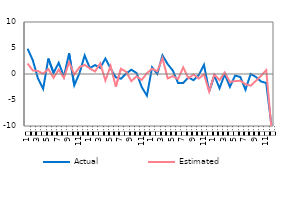
| Category | Actual | Estimated |
|---|---|---|
| 0 | 4.858 | 2.022 |
| 1900-01-01 | 2.661 | 0.677 |
| 1900-01-02 | -0.869 | 0.572 |
| 1900-01-03 | -2.837 | 0.047 |
| 1900-01-04 | 2.968 | 0.948 |
| 1900-01-05 | 0.223 | -0.717 |
| 1900-01-06 | 2.149 | 0.837 |
| 1900-01-07 | -0.505 | -0.757 |
| 1900-01-08 | 3.989 | 2.255 |
| 1900-01-09 | -2.169 | -0.102 |
| 1900-01-10 | 0.153 | 1.312 |
| 1900-01-11 | 3.57 | 1.752 |
| 1900-01-12 | 1.132 | 1.057 |
| 1900-01-13 | 1.717 | 0.488 |
| 1900-01-14 | 1.191 | 2.052 |
| 1900-01-15 | 2.98 | -1.253 |
| 1900-01-16 | 1.068 | 1.569 |
| 1900-01-17 | -0.636 | -2.469 |
| 1900-01-18 | -0.911 | 1.006 |
| 1900-01-19 | 0.103 | 0.429 |
| 1900-01-20 | 0.82 | -1.371 |
| 1900-01-21 | 0.191 | -0.443 |
| 1900-01-22 | -2.505 | -1.145 |
| 1900-01-23 | -4.177 | 0.156 |
| 1900-01-24 | 1.297 | 1.014 |
| 1900-01-25 | 0.005 | 0.526 |
| 1900-01-26 | 3.581 | 3.054 |
| 1900-01-27 | 1.91 | -0.842 |
| 1900-01-28 | 0.65 | -0.405 |
| 1900-01-29 | -1.712 | -0.982 |
| 1900-01-30 | -1.719 | 1.271 |
| 1900-01-31 | -0.648 | -0.814 |
| 1900-02-01 | -1.193 | -0.089 |
| 1900-02-02 | -0.199 | -0.865 |
| 1900-02-03 | 1.768 | -0.045 |
| 1900-02-04 | -3.324 | -3.381 |
| 1900-02-05 | -0.308 | -0.082 |
| 1900-02-06 | -2.74 | -1.176 |
| 1900-02-07 | -0.042 | 0.295 |
| 1900-02-08 | -2.475 | -1.531 |
| 1900-02-09 | -0.309 | -1.368 |
| 1900-02-10 | -0.563 | -1.298 |
| 1900-02-11 | -3.023 | -1.959 |
| 1900-02-12 | 0.009 | -2.247 |
| 1900-02-13 | -0.558 | -1.32 |
| 1900-02-14 | -1.439 | -0.355 |
| 1900-02-15 | -1.719 | 0.745 |
| 1900-02-16 | -9.852 | -10.365 |